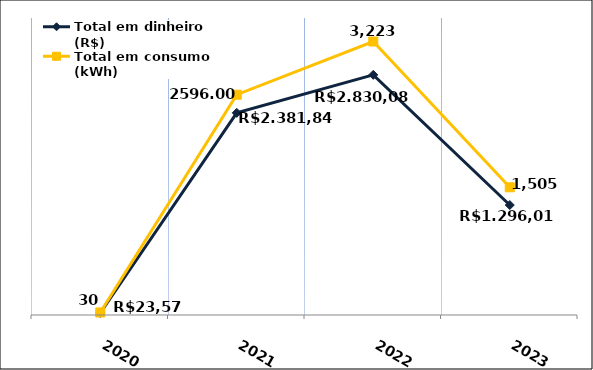
| Category | Total em dinheiro (R$) |
|---|---|
| 2020.0 | 23.57 |
| 2021.0 | 2381.84 |
| 2022.0 | 2830.08 |
| 2023.0 | 1296.01 |